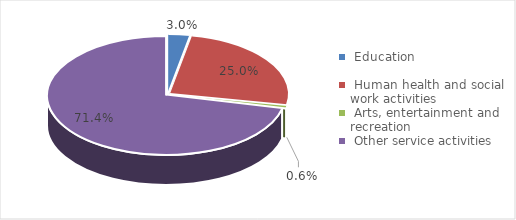
| Category | Enterprises  |
|---|---|
| Education | 0.03 |
| Human health and social work activities | 0.25 |
| Arts, entertainment and recreation | 0.006 |
| Other service activities | 0.714 |